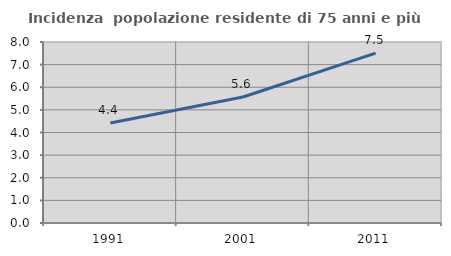
| Category | Incidenza  popolazione residente di 75 anni e più |
|---|---|
| 1991.0 | 4.421 |
| 2001.0 | 5.57 |
| 2011.0 | 7.508 |